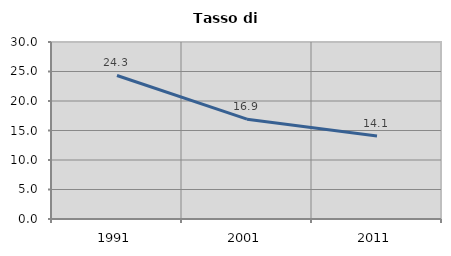
| Category | Tasso di disoccupazione   |
|---|---|
| 1991.0 | 24.323 |
| 2001.0 | 16.923 |
| 2011.0 | 14.069 |